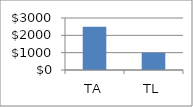
| Category | Series 0 |
|---|---|
| TA | 2500 |
| TL | 1000 |